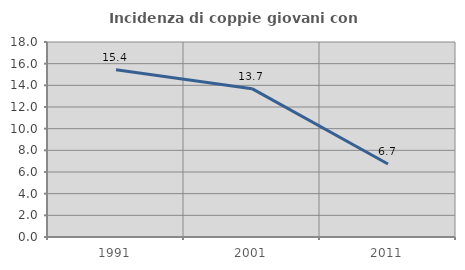
| Category | Incidenza di coppie giovani con figli |
|---|---|
| 1991.0 | 15.429 |
| 2001.0 | 13.69 |
| 2011.0 | 6.742 |